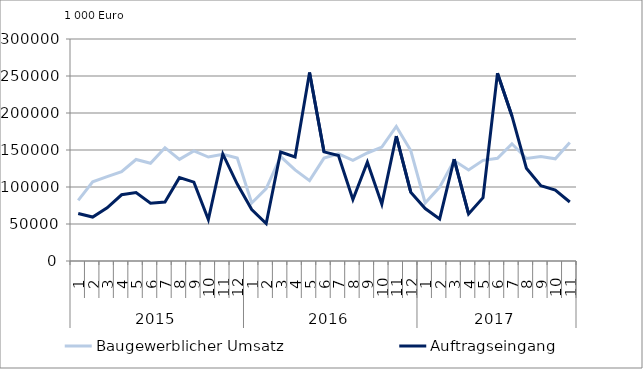
| Category | Baugewerblicher Umsatz | Auftragseingang |
|---|---|---|
| 0 | 81937.361 | 64244.383 |
| 1 | 106908.454 | 59377.677 |
| 2 | 113904.285 | 71953.971 |
| 3 | 120612.446 | 89496.024 |
| 4 | 137142.75 | 92563.213 |
| 5 | 132019.811 | 78131.737 |
| 6 | 153125.961 | 79765.729 |
| 7 | 137370.133 | 112637.987 |
| 8 | 148792.629 | 106572.56 |
| 9 | 140483.911 | 56073.767 |
| 10 | 144146.162 | 144643.688 |
| 11 | 139085.889 | 103931.175 |
| 12 | 78291.738 | 69470.357 |
| 13 | 97863.379 | 50640.033 |
| 14 | 141176.119 | 147206.65 |
| 15 | 123121.297 | 140579.009 |
| 16 | 108561.124 | 254739.334 |
| 17 | 139030.209 | 147481.644 |
| 18 | 144784.416 | 142609.658 |
| 19 | 135870.195 | 83192.156 |
| 20 | 145961.738 | 133594.351 |
| 21 | 153886.826 | 76793.838 |
| 22 | 181740.037 | 168867.568 |
| 23 | 149348.138 | 93011.853 |
| 24 | 78446.78 | 70908.903 |
| 25 | 99841.908 | 56868.408 |
| 26 | 135679.867 | 137790.423 |
| 27 | 123004.403 | 63637.761 |
| 28 | 136010.071 | 85644.63 |
| 29 | 138859.308 | 253791.552 |
| 30 | 158353.879 | 196034.198 |
| 31 | 138510.315 | 125319.873 |
| 32 | 141109.925 | 101690.626 |
| 33 | 138067.098 | 95966.626 |
| 34 | 160064.454 | 79701.993 |